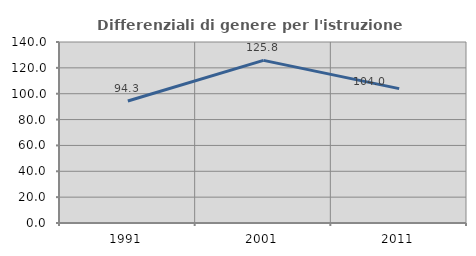
| Category | Differenziali di genere per l'istruzione superiore |
|---|---|
| 1991.0 | 94.341 |
| 2001.0 | 125.801 |
| 2011.0 | 103.951 |